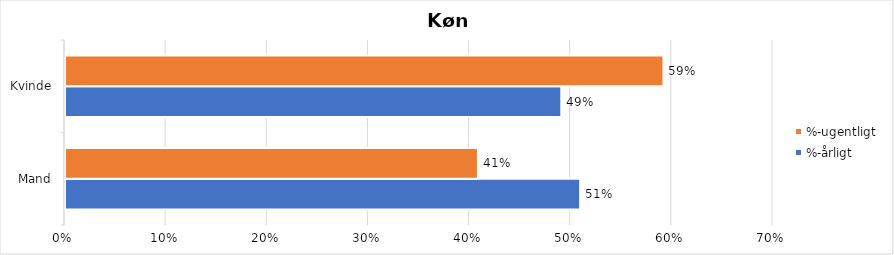
| Category | %-årligt | %-ugentligt |
|---|---|---|
| Mand | 0.509 | 0.408 |
| Kvinde | 0.491 | 0.592 |